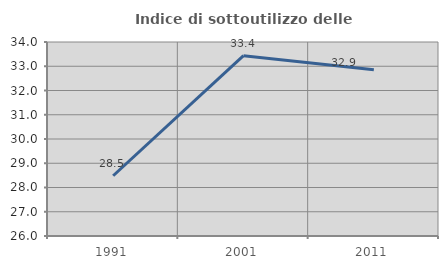
| Category | Indice di sottoutilizzo delle abitazioni  |
|---|---|
| 1991.0 | 28.484 |
| 2001.0 | 33.436 |
| 2011.0 | 32.857 |